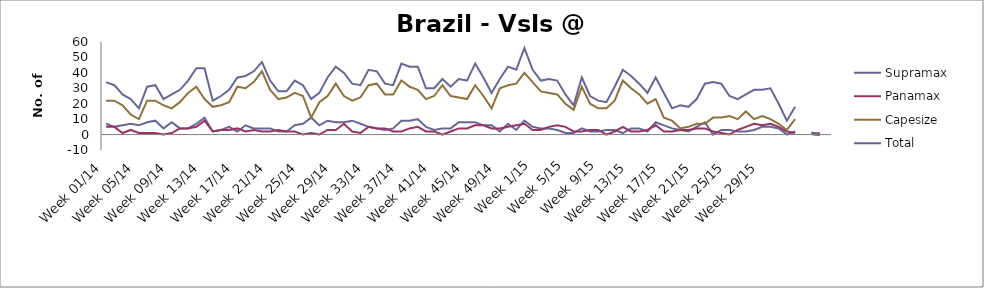
| Category | Supramax | Panamax | Capesize | Total |
|---|---|---|---|---|
| Week 01/14 | 7 | 5 | 22 | 34 |
| Week 02/14 | 5 | 5 | 22 | 32 |
| Week 03/14 | 6 | 1 | 19 | 26 |
| Week 04/14 | 7 | 3 | 13 | 23 |
| Week 05/14 | 6 | 1 | 10 | 17 |
| Week 06/14 | 8 | 1 | 22 | 31 |
| Week 07/14 | 9 | 1 | 22 | 32 |
| Week 08/14 | 4 | 0 | 19 | 23 |
| Week 09/14 | 8 | 1 | 17 | 26 |
| Week 10/14 | 4 | 4 | 21 | 29 |
| Week 11/14 | 4 | 4 | 27 | 35 |
| Week 12/14 | 7 | 5 | 31 | 43 |
| Week 13/14 | 11 | 9 | 23 | 43 |
| Week 14/14 | 2 | 2 | 18 | 22 |
| Week 15/14 | 3 | 3 | 19 | 25 |
| Week 16/14 | 5 | 3 | 21 | 29 |
| Week 17/14 | 2 | 4 | 31 | 37 |
| Week 18/14 | 6 | 2 | 30 | 38 |
| Week 19/14 | 4 | 3 | 34 | 41 |
| Week 20/14 | 4 | 2 | 41 | 47 |
| Week 21/14 | 4 | 2 | 29 | 35 |
| Week 22/14 | 2 | 3 | 23 | 28 |
| Week 23/14 | 2 | 2 | 24 | 28 |
| Week 24/14 | 6 | 2 | 27 | 35 |
| Week 25/14 | 7 | 0 | 25 | 32 |
| Week 26/14 | 11 | 1 | 11 | 23 |
| Week 27/14 | 6 | 0 | 21 | 27 |
| Week 28/14 | 9 | 3 | 25 | 37 |
| Week 29/14 | 8 | 3 | 33 | 44 |
| Week 30/14 | 8 | 7 | 25 | 40 |
| Week 31/14 | 9 | 2 | 22 | 33 |
| Week 32/14 | 7 | 1 | 24 | 32 |
| Week 33/14 | 5 | 5 | 32 | 42 |
| Week 34/14 | 4 | 4 | 33 | 41 |
| Week 35/14 | 3 | 4 | 26 | 33 |
| Week 36/14 | 4 | 2 | 26 | 32 |
| Week 37/14 | 9 | 2 | 35 | 46 |
| Week 38/14 | 9 | 4 | 31 | 44 |
| Week 39/14 | 10 | 5 | 29 | 44 |
| Week 40/14 | 5 | 2 | 23 | 30 |
| Week 41/14 | 3 | 2 | 25 | 30 |
| Week 42/14 | 4 | 0 | 32 | 36 |
| Week 43/14 | 4 | 2 | 25 | 31 |
| Week 44/14 | 8 | 4 | 24 | 36 |
| Week 45/14 | 8 | 4 | 23 | 35 |
| Week 46/14 | 8 | 6 | 32 | 46 |
| Week 47/14 | 6 | 6 | 25 | 37 |
| Week 48/14 | 6 | 4 | 17 | 27 |
| Week 49/14 | 2 | 4 | 30 | 36 |
| Week 50/14 | 7 | 5 | 32 | 44 |
| Week 51/14 | 3 | 6 | 33 | 42 |
| Week 52/14 | 9 | 7 | 40 | 56 |
| Week 1/15 | 5 | 3 | 34 | 42 |
| Week 2/15 | 4 | 3 | 28 | 35 |
| Week 3/15 | 4 | 5 | 27 | 36 |
| Week 4/15 | 3 | 6 | 26 | 35 |
| Week 5/15 | 1 | 5 | 20 | 26 |
| Week 6/15 | 1 | 2 | 16 | 19 |
| Week 7/15 | 4 | 2 | 31 | 37 |
| Week 8/15 | 2 | 3 | 20 | 25 |
| Week 9/15 | 2 | 3 | 17 | 22 |
| Week 10/15 | 3 | 0 | 17 | 21 |
| Week 11/15 | 3 | 2 | 22 | 31 |
| Week 12/15 | 1 | 5 | 35 | 42 |
| Week 13/15 | 4 | 2 | 30 | 38 |
| Week 14/15 | 4 | 2 | 26 | 33 |
| Week 15/15 | 2 | 3 | 20 | 27 |
| Week 16/15 | 8 | 6 | 23 | 37 |
| Week 17/15 | 6 | 2 | 11 | 27 |
| Week 18/15 | 4 | 2 | 9 | 17 |
| Week 19/15 | 3 | 3 | 4 | 19 |
| Week 20/15 | 2 | 3 | 5 | 18 |
| Week 21/15 | 5 | 4 | 7 | 23 |
| Week 22/15 | 8 | 4 | 7 | 33 |
| Week 23/15 | 0 | 2 | 11 | 34 |
| Week 24/15 | 3 | 1 | 11 | 33 |
| Week 25/15 | 3 | 0 | 12 | 25 |
| Week 26/15 | 2 | 3 | 10 | 23 |
| Week 27/15 | 2 | 5 | 15 | 26 |
| Week 28/15 | 3 | 7 | 10 | 29 |
| Week 29/15 | 5 | 6 | 12 | 29 |
| Week 30/15 | 5 | 7 | 10 | 30 |
| Week 31/15 | 4 | 5 | 7 | 20 |